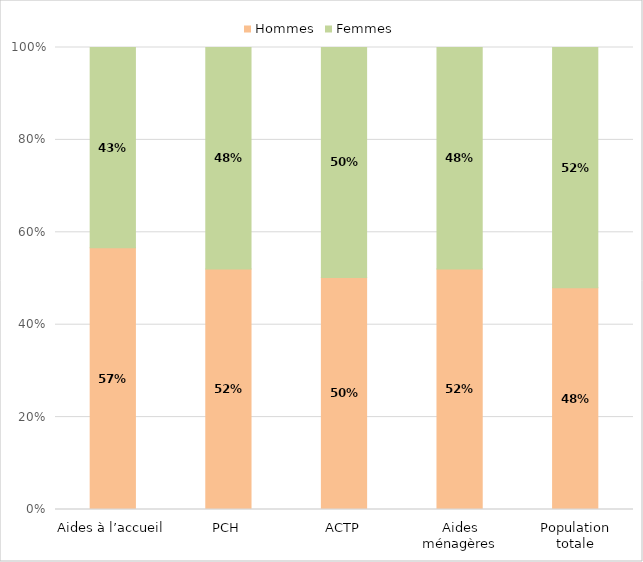
| Category | Hommes | Femmes |
|---|---|---|
| 0 | 0.567 | 0.433 |
| 1 | 0.521 | 0.479 |
| 2 | 0.502 | 0.498 |
| 3 | 0.52 | 0.48 |
| 4 | 0.48 | 0.52 |